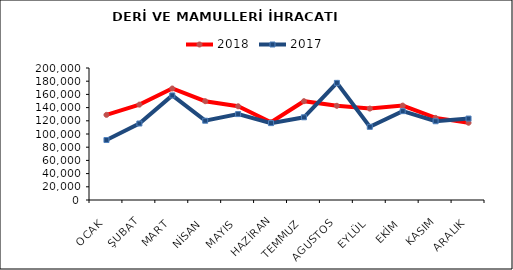
| Category | 2018 | 2017 |
|---|---|---|
| OCAK | 129006.511 | 90876.831 |
| ŞUBAT | 144501.621 | 115885.841 |
| MART | 168930.894 | 158449.08 |
| NİSAN | 149691.521 | 120138.994 |
| MAYIS | 142003.206 | 130183.294 |
| HAZİRAN | 117859.253 | 116498.402 |
| TEMMUZ | 149709.241 | 125318.245 |
| AGUSTOS | 142730.79 | 177462.748 |
| EYLÜL | 138493.283 | 110873.104 |
| EKİM | 143037.519 | 134650.652 |
| KASIM | 124377.05 | 119325.53 |
| ARALIK | 117034.266 | 123400.603 |